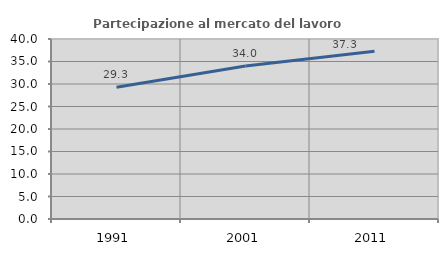
| Category | Partecipazione al mercato del lavoro  femminile |
|---|---|
| 1991.0 | 29.282 |
| 2001.0 | 33.992 |
| 2011.0 | 37.288 |